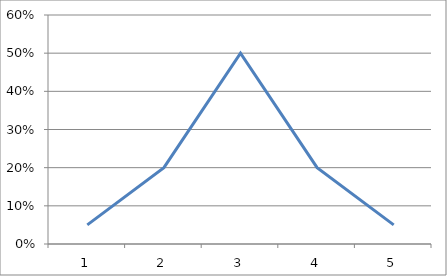
| Category | Series 0 |
|---|---|
| 0 | 0.05 |
| 1 | 0.2 |
| 2 | 0.5 |
| 3 | 0.2 |
| 4 | 0.05 |